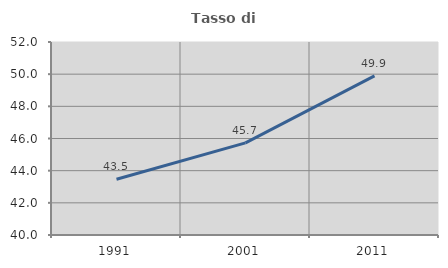
| Category | Tasso di occupazione   |
|---|---|
| 1991.0 | 43.467 |
| 2001.0 | 45.729 |
| 2011.0 | 49.897 |